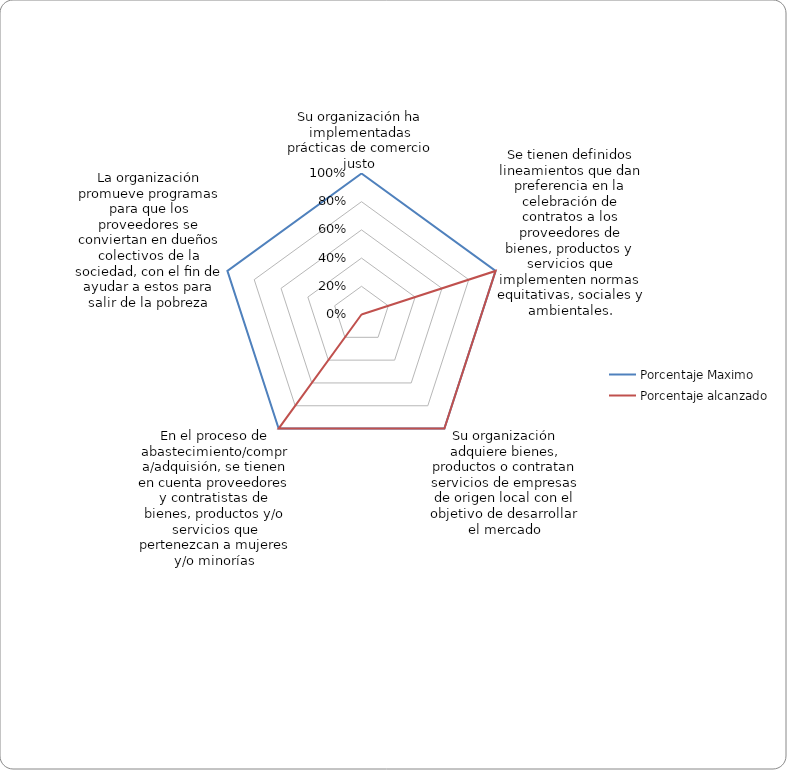
| Category | Porcentaje Maximo | Porcentaje alcanzado |
|---|---|---|
| Su organización ha implementadas prácticas de comercio justo  | 1 | 0 |
| Se tienen definidos lineamientos que dan preferencia en la celebración de contratos a los proveedores de bienes, productos y servicios que implementen normas equitativas, sociales y ambientales. | 1 | 1 |
| Su organización adquiere bienes, productos o contratan servicios de empresas de origen local con el objetivo de desarrollar el mercado | 1 | 1 |
| En el proceso de abastecimiento/compra/adquisión, se tienen en cuenta proveedores y contratistas de bienes, productos y/o servicios que pertenezcan a mujeres y/o minorías | 1 | 1 |
| La organización promueve programas para que los proveedores se conviertan en dueños colectivos de la sociedad, con el ﬁn de ayudar a estos para salir de la pobreza | 1 | 0 |